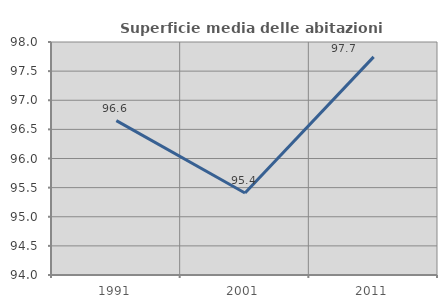
| Category | Superficie media delle abitazioni occupate |
|---|---|
| 1991.0 | 96.65 |
| 2001.0 | 95.409 |
| 2011.0 | 97.744 |